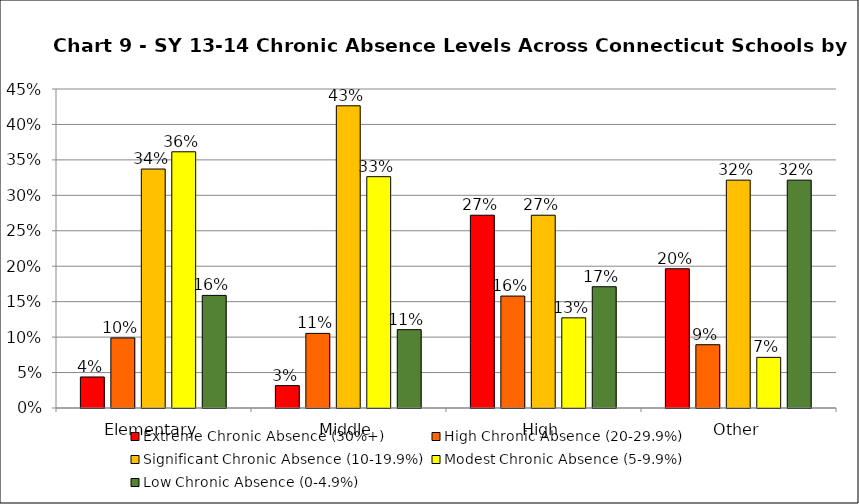
| Category | Extreme Chronic Absence (30%+) | High Chronic Absence (20-29.9%) | Significant Chronic Absence (10-19.9%) | Modest Chronic Absence (5-9.9%) | Low Chronic Absence (0-4.9%) |
|---|---|---|---|---|---|
| 0 | 0.044 | 0.099 | 0.337 | 0.361 | 0.159 |
| 1 | 0.032 | 0.105 | 0.426 | 0.326 | 0.111 |
| 2 | 0.272 | 0.158 | 0.272 | 0.127 | 0.171 |
| 3 | 0.196 | 0.089 | 0.321 | 0.071 | 0.321 |